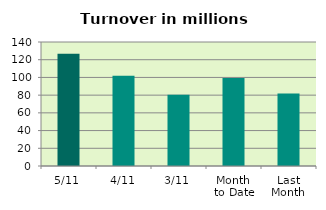
| Category | Series 0 |
|---|---|
| 5/11 | 126.823 |
| 4/11 | 101.928 |
| 3/11 | 80.33 |
| Month 
to Date | 99.271 |
| Last
Month | 81.795 |